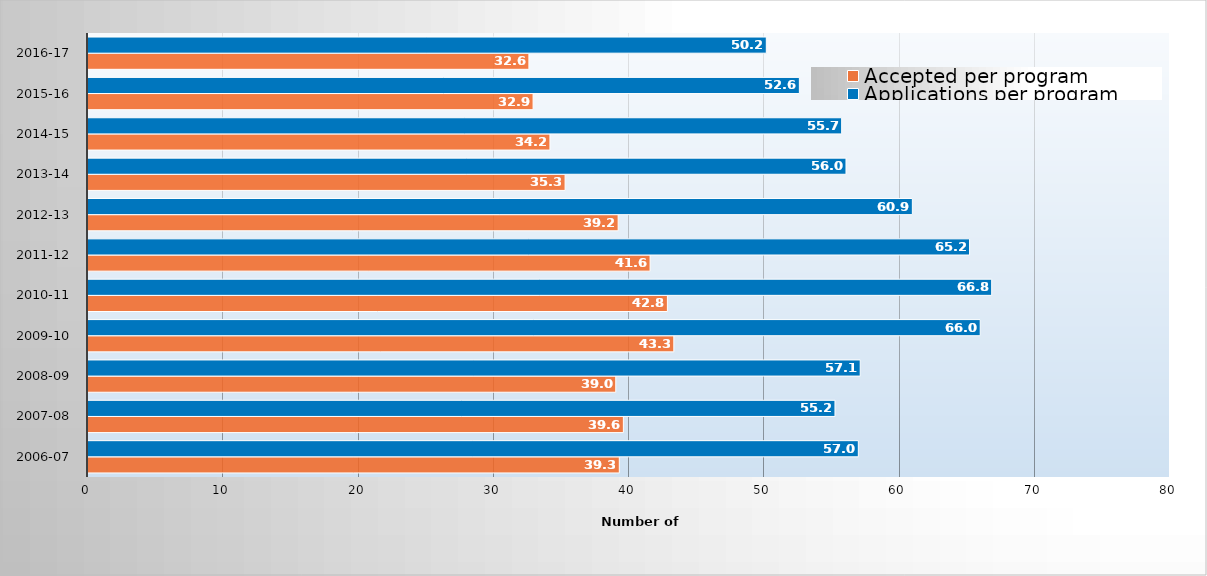
| Category | Accepted per program | Applications per program |
|---|---|---|
| 2006-07 | 39.284 | 56.955 |
| 2007-08 | 39.583 | 55.229 |
| 2008-09 | 39.022 | 57.096 |
| 2009-10 | 43.314 | 65.968 |
| 2010-11 | 42.839 | 66.817 |
| 2011-12 | 41.557 | 65.181 |
| 2012-13 | 39.198 | 60.95 |
| 2013-14 | 35.275 | 56.044 |
| 2014-15 | 34.154 | 55.724 |
| 2015-16 | 32.909 | 52.597 |
| 2016-17 | 32.599 | 50.152 |